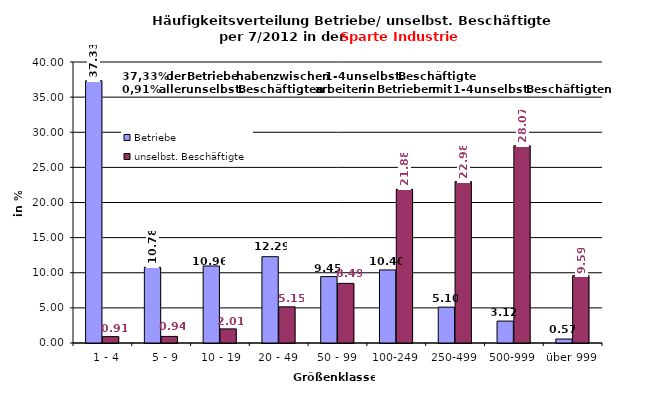
| Category | Betriebe | unselbst. Beschäftigte |
|---|---|---|
|   1 - 4 | 37.335 | 0.908 |
|   5 - 9 | 10.775 | 0.937 |
|  10 - 19 | 10.964 | 2.01 |
| 20 - 49 | 12.287 | 5.147 |
| 50 - 99 | 9.452 | 8.486 |
| 100-249 | 10.397 | 21.882 |
| 250-499 | 5.104 | 22.976 |
| 500-999 | 3.119 | 28.07 |
| über 999 | 0.567 | 9.585 |